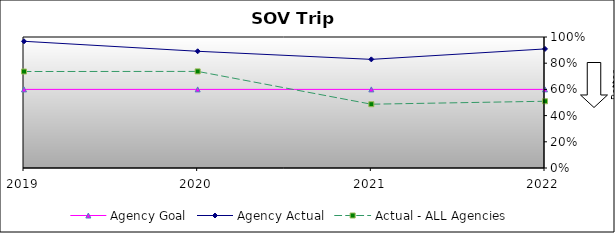
| Category | Agency Goal | Agency Actual | Actual - ALL Agencies |
|---|---|---|---|
| 2019.0 | 0.6 | 0.967 | 0.736 |
| 2020.0 | 0.6 | 0.891 | 0.737 |
| 2021.0 | 0.6 | 0.829 | 0.487 |
| 2022.0 | 0.6 | 0.909 | 0.509 |